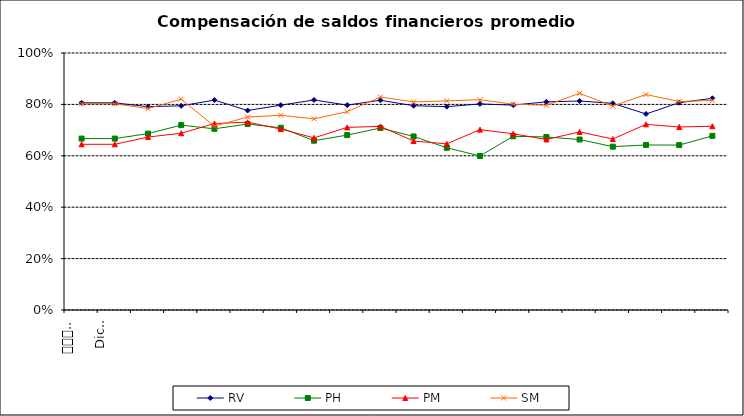
| Category | RV | PH | PM | SM |
|---|---|---|---|---|
| 0 | 0.806 | 0.667 | 0.645 | 0.803 |
| 1 | 0.806 | 0.667 | 0.645 | 0.803 |
| 2 | 0.791 | 0.686 | 0.673 | 0.784 |
| 3 | 0.794 | 0.719 | 0.688 | 0.82 |
| 4 | 0.817 | 0.705 | 0.726 | 0.715 |
| 5 | 0.776 | 0.724 | 0.731 | 0.751 |
| 6 | 0.797 | 0.709 | 0.704 | 0.758 |
| 7 | 0.817 | 0.659 | 0.67 | 0.744 |
| 8 | 0.797 | 0.681 | 0.711 | 0.772 |
| 9 | 0.816 | 0.708 | 0.715 | 0.829 |
| 10 | 0.795 | 0.675 | 0.657 | 0.81 |
| 11 | 0.791 | 0.631 | 0.646 | 0.814 |
| 12 | 0.802 | 0.599 | 0.702 | 0.818 |
| 13 | 0.797 | 0.676 | 0.686 | 0.801 |
| 14 | 0.81 | 0.673 | 0.664 | 0.797 |
| 15 | 0.813 | 0.663 | 0.693 | 0.843 |
| 16 | 0.804 | 0.636 | 0.665 | 0.794 |
| 17 | 0.763 | 0.642 | 0.722 | 0.839 |
| 18 | 0.807 | 0.642 | 0.712 | 0.811 |
| 19 | 0.824 | 0.678 | 0.715 | 0.816 |